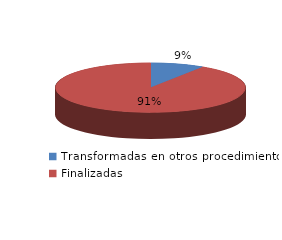
| Category | Series 0 |
|---|---|
| Transformadas en otros procedimientos | 2893 |
| Finalizadas | 28768 |